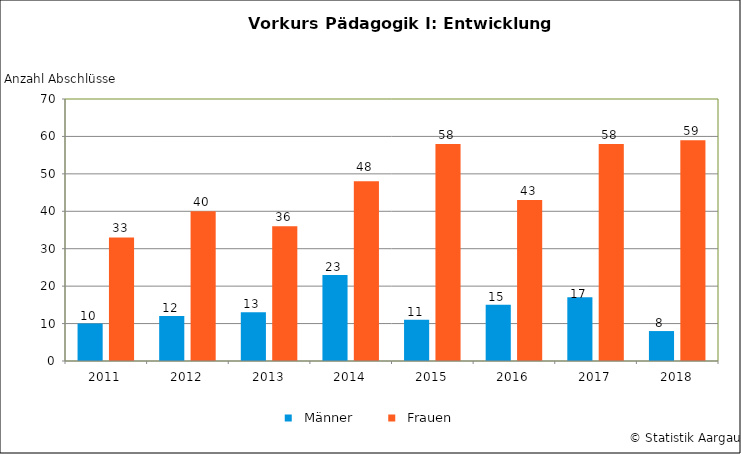
| Category |   Männer |   Frauen |
|---|---|---|
| 2011 | 10 | 33 |
| 2012 | 12 | 40 |
| 2013 | 13 | 36 |
| 2014 | 23 | 48 |
| 2015 | 11 | 58 |
| 2016 | 15 | 43 |
| 2017 | 17 | 58 |
| 2018 | 8 | 59 |